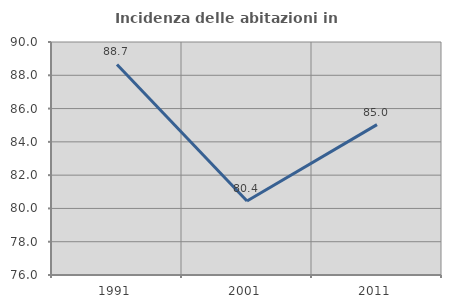
| Category | Incidenza delle abitazioni in proprietà  |
|---|---|
| 1991.0 | 88.652 |
| 2001.0 | 80.443 |
| 2011.0 | 85.037 |